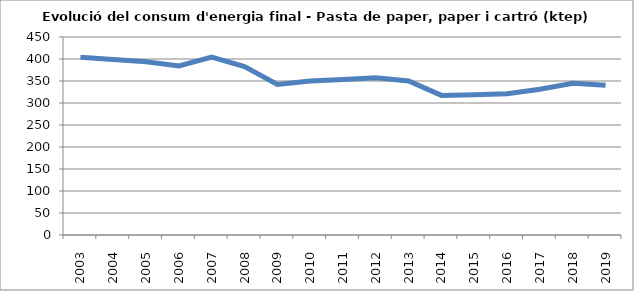
| Category | 404,0 |
|---|---|
| 2003.0 | 403.97 |
| 2004.0 | 398.77 |
| 2005.0 | 393.95 |
| 2006.0 | 384.31 |
| 2007.0 | 404.29 |
| 2008.0 | 382.86 |
| 2009.0 | 342.31 |
| 2010.0 | 349.74 |
| 2011.0 | 353.39 |
| 2012.0 | 357.34 |
| 2013.0 | 350.1 |
| 2014.0 | 317.33 |
| 2015.0 | 318.71 |
| 2016.0 | 321 |
| 2017.0 | 331.26 |
| 2018.0 | 344.93 |
| 2019.0 | 340.11 |